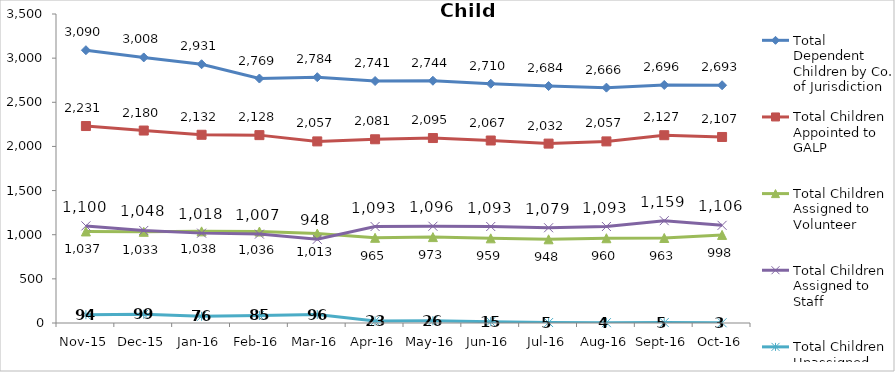
| Category | Total Dependent Children by Co. of Jurisdiction | Total Children Appointed to GALP | Total Children Assigned to Volunteer | Total Children Assigned to Staff | Total Children Unassigned |
|---|---|---|---|---|---|
| Nov-15 | 3090 | 2231 | 1037 | 1100 | 94 |
| Dec-15 | 3008 | 2180 | 1033 | 1048 | 99 |
| Jan-16 | 2931 | 2132 | 1038 | 1018 | 76 |
| Feb-16 | 2769 | 2128 | 1036 | 1007 | 85 |
| Mar-16 | 2784 | 2057 | 1013 | 948 | 96 |
| Apr-16 | 2741 | 2081 | 965 | 1093 | 23 |
| May-16 | 2744 | 2095 | 973 | 1096 | 26 |
| Jun-16 | 2710 | 2067 | 959 | 1093 | 15 |
| Jul-16 | 2684 | 2032 | 948 | 1079 | 5 |
| Aug-16 | 2666 | 2057 | 960 | 1093 | 4 |
| Sep-16 | 2696 | 2127 | 963 | 1159 | 5 |
| Oct-16 | 2693 | 2107 | 998 | 1106 | 3 |